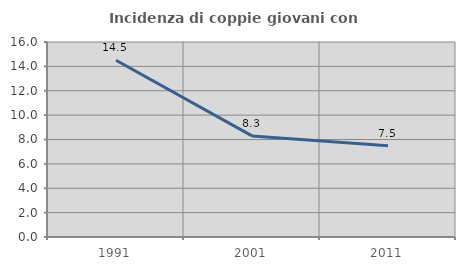
| Category | Incidenza di coppie giovani con figli |
|---|---|
| 1991.0 | 14.499 |
| 2001.0 | 8.293 |
| 2011.0 | 7.481 |